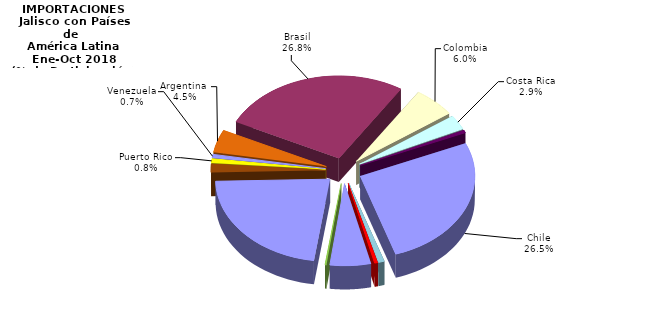
| Category | IMPORTACIONES |
|---|---|
| Argentina  | 54.504 |
| Brasil | 327.218 |
| Colombia | 72.651 |
| Costa Rica | 34.944 |
| Cuba | 6.87 |
| Chile | 322.945 |
| Ecuador | 10.18 |
| El Salvador | 5.674 |
| Guatemala | 70.348 |
| Honduras | 2.363 |
| Panamá | 272.256 |
| Perú | 19.723 |
| Puerto Rico | 10.34 |
| Venezuela | 8.782 |